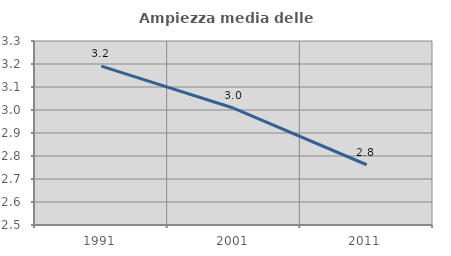
| Category | Ampiezza media delle famiglie |
|---|---|
| 1991.0 | 3.191 |
| 2001.0 | 3.008 |
| 2011.0 | 2.762 |